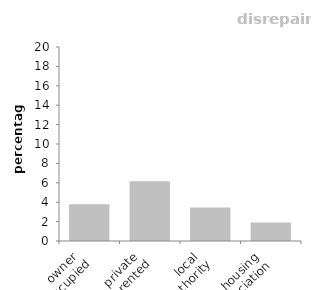
| Category | disrepair |
|---|---|
| owner 
occupied | 3.782 |
| private 
rented | 6.162 |
| local 
authority | 3.455 |
| housing 
association | 1.909 |